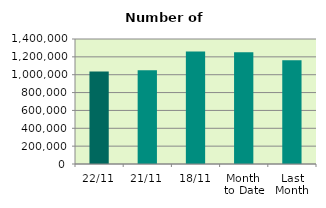
| Category | Series 0 |
|---|---|
| 22/11 | 1036964 |
| 21/11 | 1049438 |
| 18/11 | 1260766 |
| Month 
to Date | 1251223.125 |
| Last
Month | 1161301.714 |